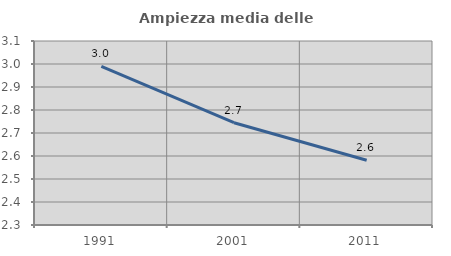
| Category | Ampiezza media delle famiglie |
|---|---|
| 1991.0 | 2.99 |
| 2001.0 | 2.745 |
| 2011.0 | 2.581 |